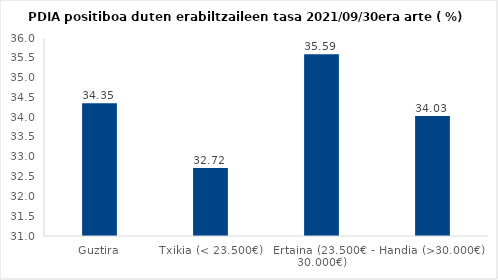
| Category | Series 0 |
|---|---|
| Guztira | 34.355 |
| Txikia (< 23.500€) | 32.716 |
| Ertaina (23.500€ - 30.000€) | 35.591 |
| Handia (>30.000€) | 34.027 |